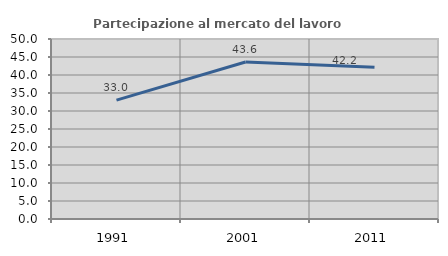
| Category | Partecipazione al mercato del lavoro  femminile |
|---|---|
| 1991.0 | 33.016 |
| 2001.0 | 43.598 |
| 2011.0 | 42.157 |